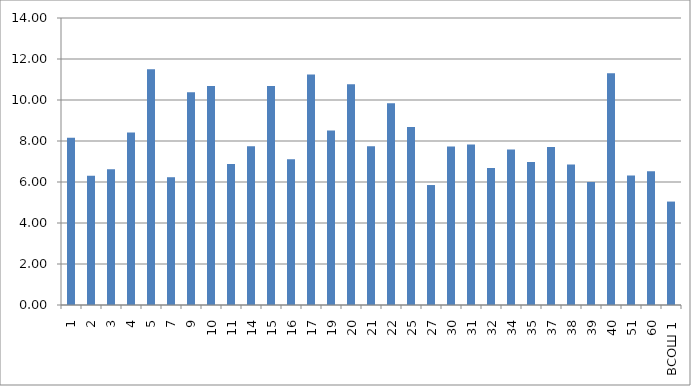
| Category | Series 0 |
|---|---|
| 1 | 8.157 |
| 2 | 6.304 |
| 3 | 6.625 |
| 4 | 8.417 |
| 5 | 11.5 |
| 7 | 6.233 |
| 9 | 10.373 |
| 10 | 10.677 |
| 11 | 6.875 |
| 14 | 7.75 |
| 15 | 10.685 |
| 16 | 7.114 |
| 17 | 11.25 |
| 19 | 8.51 |
| 20 | 10.773 |
| 21 | 7.745 |
| 22 | 9.838 |
| 25 | 8.679 |
| 27 | 5.852 |
| 30 | 7.736 |
| 31 | 7.828 |
| 32 | 6.688 |
| 34 | 7.588 |
| 35 | 6.978 |
| 37 | 7.711 |
| 38 | 6.857 |
| 39 | 6 |
| 40 | 11.302 |
| 51 | 6.318 |
| 60 | 6.526 |
| ВСОШ 1 | 5.045 |